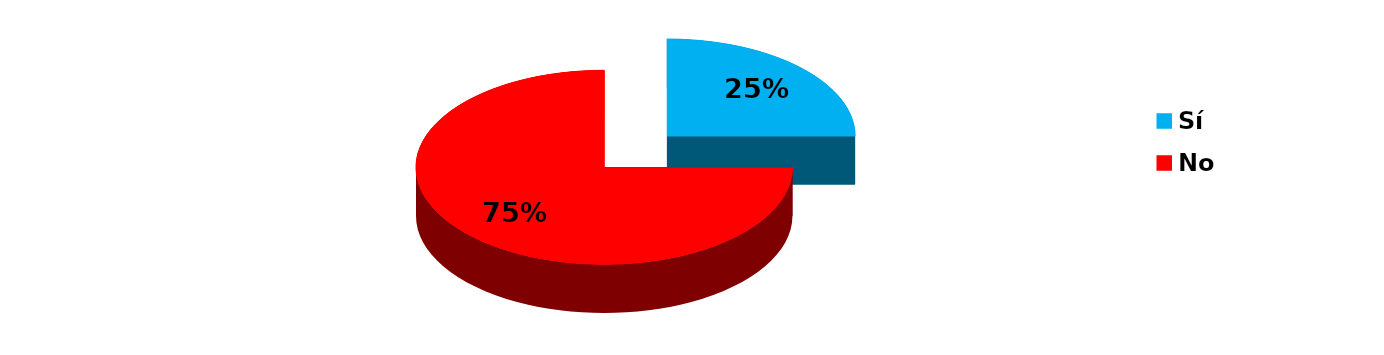
| Category | Series 0 |
|---|---|
| Sí | 1 |
| No | 3 |